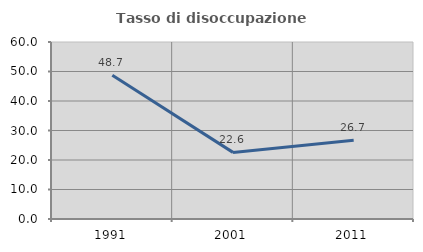
| Category | Tasso di disoccupazione giovanile  |
|---|---|
| 1991.0 | 48.744 |
| 2001.0 | 22.581 |
| 2011.0 | 26.667 |